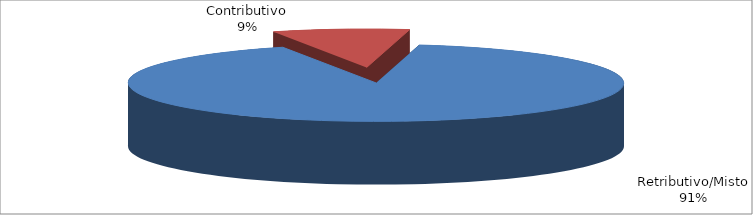
| Category | Decorrenti ANNO 2021 |
|---|---|
| Retributivo/Misto | 314680 |
| Contributivo | 30795 |